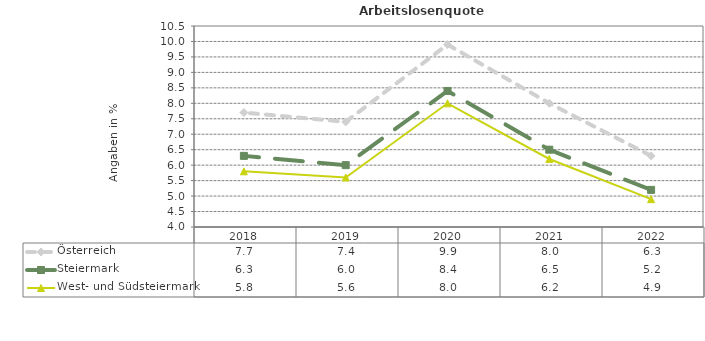
| Category | Österreich | Steiermark | West- und Südsteiermark |
|---|---|---|---|
| 2022.0 | 6.3 | 5.2 | 4.9 |
| 2021.0 | 8 | 6.5 | 6.2 |
| 2020.0 | 9.9 | 8.4 | 8 |
| 2019.0 | 7.4 | 6 | 5.6 |
| 2018.0 | 7.7 | 6.3 | 5.8 |